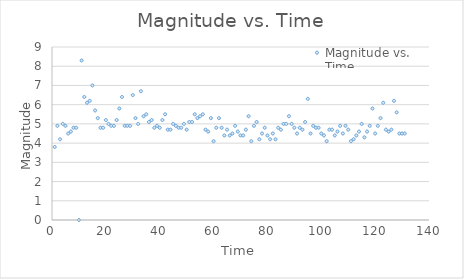
| Category | Magnitude vs. Time |
|---|---|
| 0 | 3.8 |
| 1 | 4.9 |
| 2 | 4.2 |
| 3 | 5 |
| 4 | 4.9 |
| 5 | 4.5 |
| 6 | 4.6 |
| 7 | 4.8 |
| 8 | 4.8 |
| 9 | 0 |
| 10 | 8.3 |
| 11 | 6.4 |
| 12 | 6.1 |
| 13 | 6.2 |
| 14 | 7 |
| 15 | 5.7 |
| 16 | 5.3 |
| 17 | 4.8 |
| 18 | 4.8 |
| 19 | 5.2 |
| 20 | 5 |
| 21 | 4.9 |
| 22 | 4.9 |
| 23 | 5.2 |
| 24 | 5.8 |
| 25 | 6.4 |
| 26 | 4.9 |
| 27 | 4.9 |
| 28 | 4.9 |
| 29 | 6.5 |
| 30 | 5.3 |
| 31 | 5 |
| 32 | 6.7 |
| 33 | 5.4 |
| 34 | 5.5 |
| 35 | 5.1 |
| 36 | 5.2 |
| 37 | 4.8 |
| 38 | 4.9 |
| 39 | 4.8 |
| 40 | 5.2 |
| 41 | 5.5 |
| 42 | 4.7 |
| 43 | 4.7 |
| 44 | 5 |
| 45 | 4.9 |
| 46 | 4.8 |
| 47 | 4.8 |
| 48 | 5 |
| 49 | 4.7 |
| 50 | 5.1 |
| 51 | 5.1 |
| 52 | 5.5 |
| 53 | 5.3 |
| 54 | 5.4 |
| 55 | 5.5 |
| 56 | 4.7 |
| 57 | 4.6 |
| 58 | 5.3 |
| 59 | 4.1 |
| 60 | 4.8 |
| 61 | 5.3 |
| 62 | 4.8 |
| 63 | 4.4 |
| 64 | 4.7 |
| 65 | 4.4 |
| 66 | 4.5 |
| 67 | 4.9 |
| 68 | 4.6 |
| 69 | 4.4 |
| 70 | 4.4 |
| 71 | 4.7 |
| 72 | 5.4 |
| 73 | 4.1 |
| 74 | 4.9 |
| 75 | 5.1 |
| 76 | 4.2 |
| 77 | 4.5 |
| 78 | 4.8 |
| 79 | 4.4 |
| 80 | 4.2 |
| 81 | 4.5 |
| 82 | 4.2 |
| 83 | 4.8 |
| 84 | 4.7 |
| 85 | 5 |
| 86 | 5 |
| 87 | 5.4 |
| 88 | 5 |
| 89 | 4.8 |
| 90 | 4.5 |
| 91 | 4.8 |
| 92 | 4.7 |
| 93 | 5.1 |
| 94 | 6.3 |
| 95 | 4.5 |
| 96 | 4.9 |
| 97 | 4.8 |
| 98 | 4.8 |
| 99 | 4.5 |
| 100 | 4.4 |
| 101 | 4.1 |
| 102 | 4.7 |
| 103 | 4.7 |
| 104 | 4.4 |
| 105 | 4.6 |
| 106 | 4.9 |
| 107 | 4.5 |
| 108 | 4.9 |
| 109 | 4.7 |
| 110 | 4.1 |
| 111 | 4.2 |
| 112 | 4.4 |
| 113 | 4.6 |
| 114 | 5 |
| 115 | 4.3 |
| 116 | 4.6 |
| 117 | 4.9 |
| 118 | 5.8 |
| 119 | 4.5 |
| 120 | 4.9 |
| 121 | 5.3 |
| 122 | 6.1 |
| 123 | 4.7 |
| 124 | 4.6 |
| 125 | 4.7 |
| 126 | 6.2 |
| 127 | 5.6 |
| 128 | 4.5 |
| 129 | 4.5 |
| 130 | 4.5 |